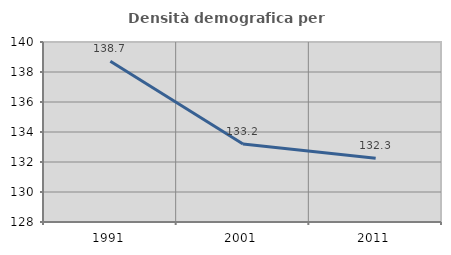
| Category | Densità demografica |
|---|---|
| 1991.0 | 138.718 |
| 2001.0 | 133.206 |
| 2011.0 | 132.252 |